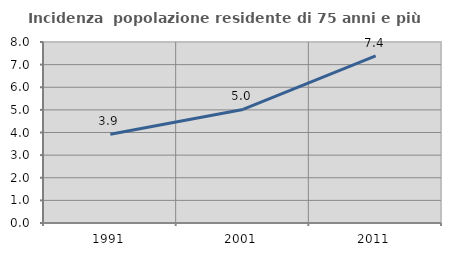
| Category | Incidenza  popolazione residente di 75 anni e più |
|---|---|
| 1991.0 | 3.921 |
| 2001.0 | 5.019 |
| 2011.0 | 7.386 |